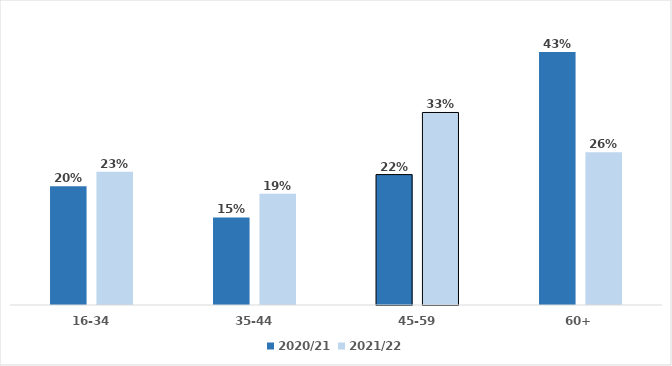
| Category | 2020/21 | 2021/22 |
|---|---|---|
| 16-34 | 0.201 | 0.226 |
| 35-44 | 0.148 | 0.189 |
| 45-59 | 0.221 | 0.326 |
| 60+ | 0.429 | 0.259 |